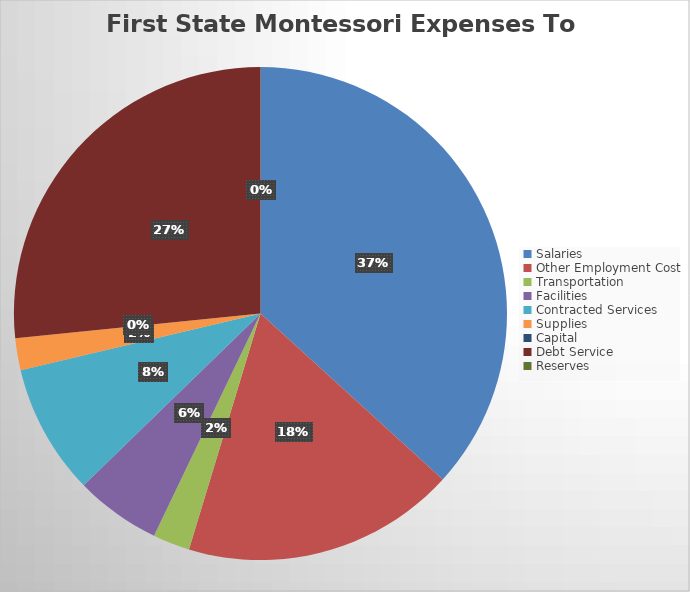
| Category | Series 0 |
|---|---|
| Salaries | 1068188.17 |
| Other Employment Cost | 521202.26 |
| Transportation | 70436 |
| Facilities | 163228.51 |
| Contracted Services | 249191.08 |
| Supplies | 60983.25 |
| Capital | 0 |
| Debt Service | 773103.4 |
| Reserves | 0 |